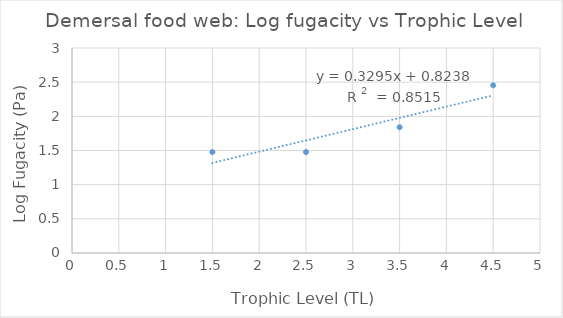
| Category | Log fugacity vs Trophic Level |
|---|---|
| 1.5 | 1.477 |
| 2.5 | 1.477 |
| 3.5 | 1.841 |
| 4.5 | 2.454 |